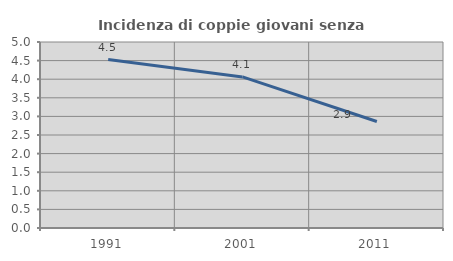
| Category | Incidenza di coppie giovani senza figli |
|---|---|
| 1991.0 | 4.528 |
| 2001.0 | 4.061 |
| 2011.0 | 2.862 |